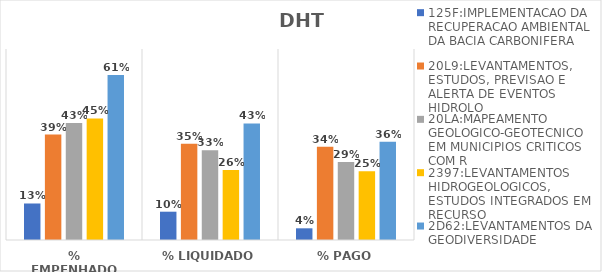
| Category | 125F:IMPLEMENTACAO DA RECUPERACAO AMBIENTAL DA BACIA CARBONIFERA | 20L9:LEVANTAMENTOS, ESTUDOS, PREVISAO E ALERTA DE EVENTOS HIDROLO | 20LA:MAPEAMENTO GEOLOGICO-GEOTECNICO EM MUNICIPIOS CRITICOS COM R | 2397:LEVANTAMENTOS HIDROGEOLOGICOS, ESTUDOS INTEGRADOS EM RECURSO | 2D62:LEVANTAMENTOS DA GEODIVERSIDADE |
|---|---|---|---|---|---|
| % EMPENHADO | 0.134 | 0.386 | 0.428 | 0.446 | 0.605 |
| % LIQUIDADO | 0.104 | 0.353 | 0.329 | 0.256 | 0.427 |
| % PAGO | 0.043 | 0.342 | 0.286 | 0.252 | 0.36 |